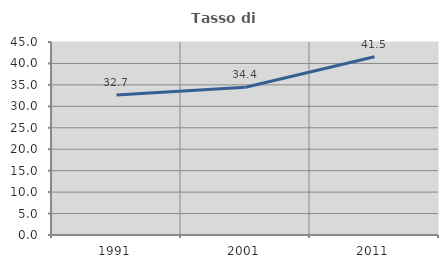
| Category | Tasso di occupazione   |
|---|---|
| 1991.0 | 32.67 |
| 2001.0 | 34.437 |
| 2011.0 | 41.548 |